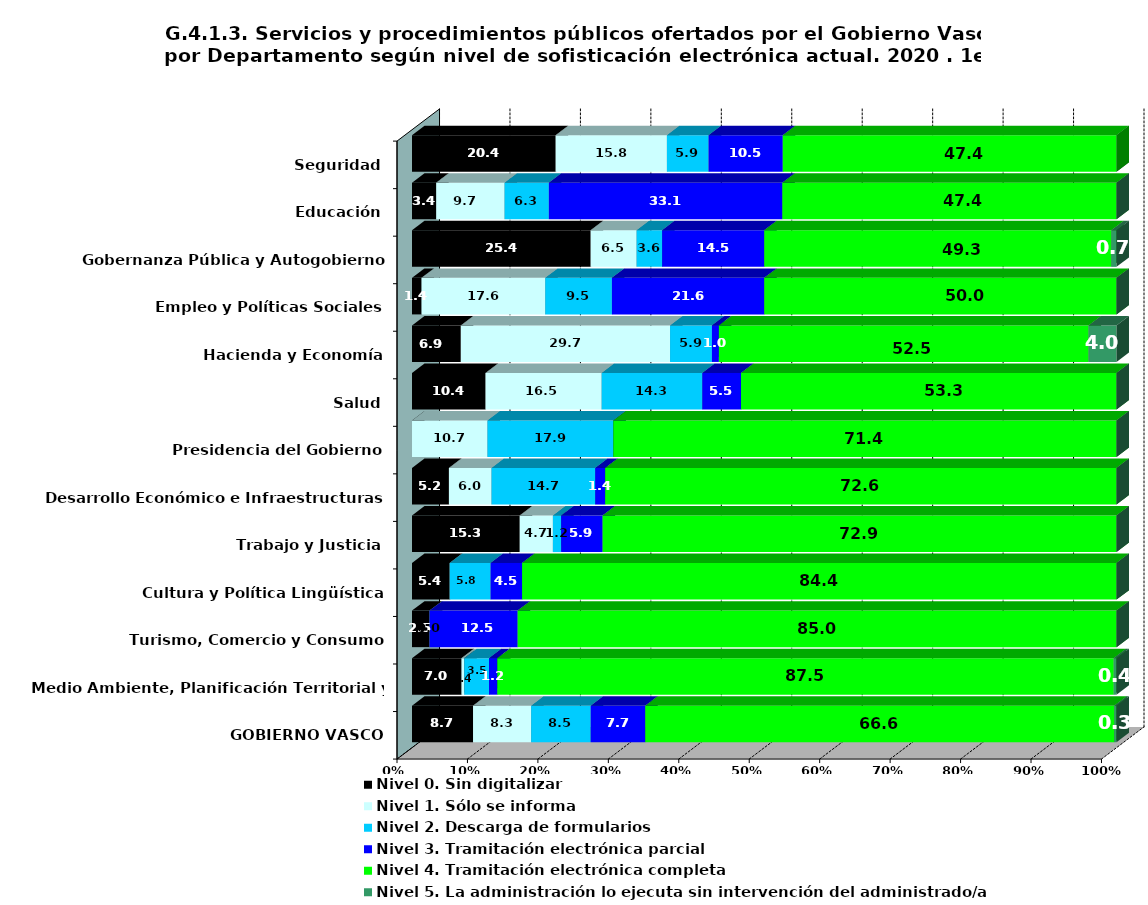
| Category | Nivel 0. Sin digitalizar | Nivel 1. Sólo se informa | Nivel 2. Descarga de formularios | Nivel 3. Tramitación electrónica parcial | Nivel 4. Tramitación electrónica completa | Nivel 5. La administración lo ejecuta sin intervención del administrado/a |
|---|---|---|---|---|---|---|
| GOBIERNO VASCO | 8.662 | 8.252 | 8.457 | 7.74 | 66.581 | 0.308 |
| Medio Ambiente, Planificación Territorial y Vivienda | 7.031 | 0.391 | 3.516 | 1.172 | 87.5 | 0.391 |
| Turismo, Comercio y Consumo | 2.5 | 0 | 0 | 12.5 | 85 | 0 |
| Cultura y Política Lingüística | 5.357 | 0 | 5.804 | 4.464 | 84.375 | 0 |
| Trabajo y Justicia | 15.294 | 4.706 | 1.176 | 5.882 | 72.941 | 0 |
| Desarrollo Económico e Infraestructuras | 5.242 | 6.048 | 14.718 | 1.411 | 72.581 | 0 |
| Presidencia del Gobierno | 0 | 10.714 | 17.857 | 0 | 71.429 | 0 |
| Salud | 10.44 | 16.484 | 14.286 | 5.495 | 53.297 | 0 |
| Hacienda y Economía | 6.931 | 29.703 | 5.941 | 0.99 | 52.475 | 3.96 |
| Empleo y Políticas Sociales | 1.351 | 17.568 | 9.459 | 21.622 | 50 | 0 |
| Gobernanza Pública y Autogobierno | 25.362 | 6.522 | 3.623 | 14.493 | 49.275 | 0.725 |
| Educación | 3.429 | 9.714 | 6.286 | 33.143 | 47.429 | 0 |
| Seguridad | 20.395 | 15.789 | 5.921 | 10.526 | 47.368 | 0 |